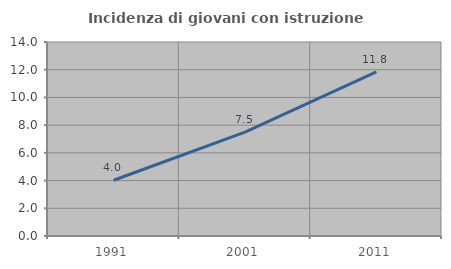
| Category | Incidenza di giovani con istruzione universitaria |
|---|---|
| 1991.0 | 4.025 |
| 2001.0 | 7.5 |
| 2011.0 | 11.845 |